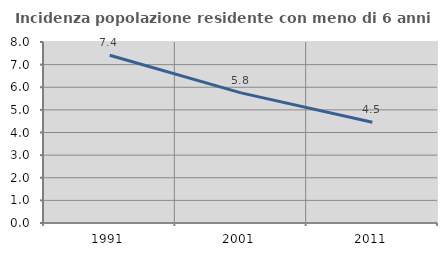
| Category | Incidenza popolazione residente con meno di 6 anni |
|---|---|
| 1991.0 | 7.417 |
| 2001.0 | 5.751 |
| 2011.0 | 4.454 |